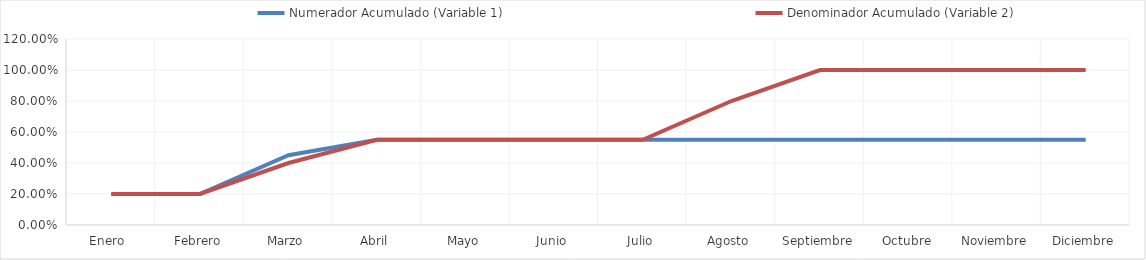
| Category | Numerador Acumulado (Variable 1) | Denominador Acumulado (Variable 2) |
|---|---|---|
| Enero  | 0.2 | 0.2 |
| Febrero | 0.2 | 0.2 |
| Marzo | 0.45 | 0.4 |
| Abril | 0.55 | 0.55 |
| Mayo | 0.55 | 0.55 |
| Junio | 0.55 | 0.55 |
| Julio | 0.55 | 0.55 |
| Agosto | 0.55 | 0.8 |
| Septiembre | 0.55 | 1 |
| Octubre | 0.55 | 1 |
| Noviembre | 0.55 | 1 |
| Diciembre | 0.55 | 1 |